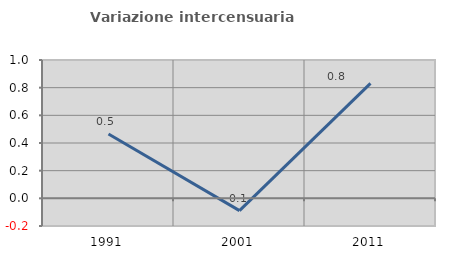
| Category | Variazione intercensuaria annua |
|---|---|
| 1991.0 | 0.466 |
| 2001.0 | -0.089 |
| 2011.0 | 0.831 |